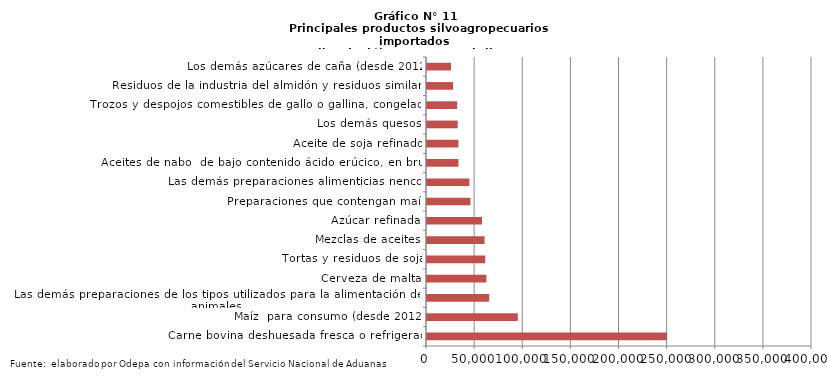
| Category | Series 0 |
|---|---|
| Carne bovina deshuesada fresca o refrigerada | 249427.242 |
| Maíz  para consumo (desde 2012) | 94354.001 |
| Las demás preparaciones de los tipos utilizados para la alimentación de los animales | 64595.875 |
| Cerveza de malta | 61723.514 |
| Tortas y residuos de soja | 60496.879 |
| Mezclas de aceites | 59811.778 |
| Azúcar refinada | 57184.52 |
| Preparaciones que contengan maíz | 45141.348 |
| Las demás preparaciones alimenticias nencop | 44052.145 |
| Aceites de nabo  de bajo contenido ácido erúcico, en bruto | 32690.521 |
| Aceite de soja refinado | 32648.511 |
| Los demás quesos | 31882.839 |
| Trozos y despojos comestibles de gallo o gallina, congelados | 31323.648 |
| Residuos de la industria del almidón y residuos similares | 27105.596 |
| Los demás azúcares de caña (desde 2012) | 24935.764 |